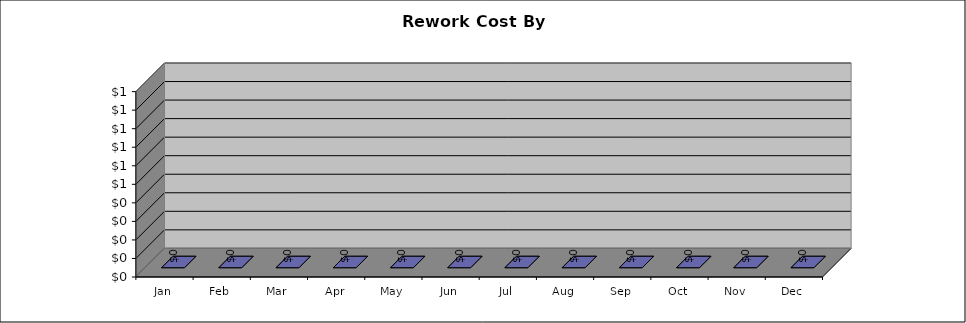
| Category | Total
Cost |
|---|---|
| Jan | 0 |
| Feb | 0 |
| Mar | 0 |
| Apr | 0 |
| May | 0 |
| Jun | 0 |
| Jul | 0 |
| Aug | 0 |
| Sep | 0 |
| Oct | 0 |
| Nov | 0 |
| Dec | 0 |